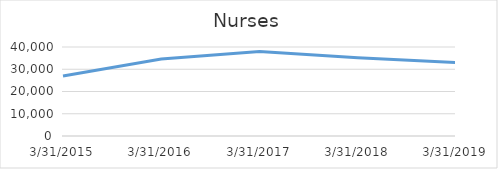
| Category | Nurses |
|---|---|
| 3/31/15 | 27012 |
| 3/31/16 | 34572 |
| 3/31/17 | 38024 |
| 3/31/18 | 35115 |
| 3/31/19 | 33035 |